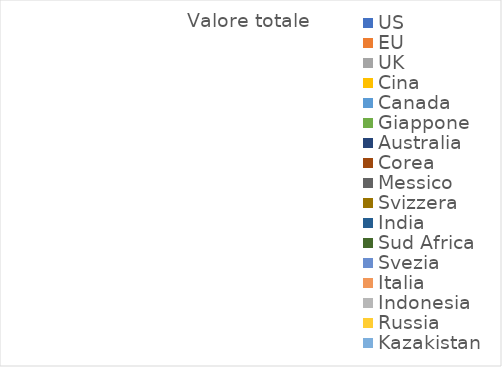
| Category | Valore totale |
|---|---|
| US | 0 |
| EU | 0 |
| UK | 0 |
| Cina | 0 |
| Canada | 0 |
| Giappone | 0 |
| Australia | 0 |
| Corea | 0 |
| Messico | 0 |
| Svizzera | 0 |
| India | 0 |
| Sud Africa | 0 |
| Svezia | 0 |
| Italia | 0 |
| Indonesia | 0 |
| Russia | 0 |
| Kazakistan | 0 |